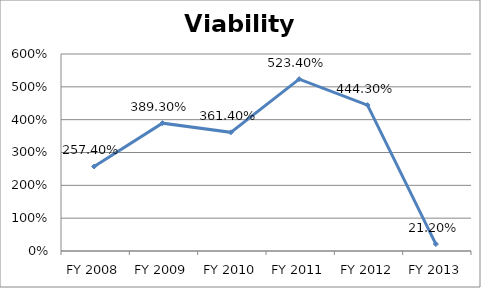
| Category | Viability ratio |
|---|---|
| FY 2013 | 0.212 |
| FY 2012 | 4.443 |
| FY 2011 | 5.234 |
| FY 2010 | 3.614 |
| FY 2009 | 3.893 |
| FY 2008 | 2.574 |